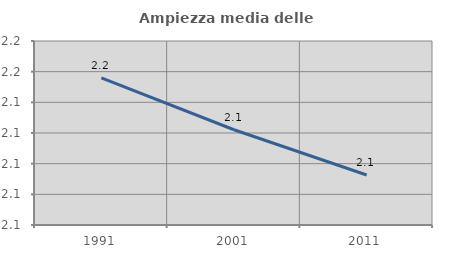
| Category | Ampiezza media delle famiglie |
|---|---|
| 1991.0 | 2.156 |
| 2001.0 | 2.122 |
| 2011.0 | 2.093 |